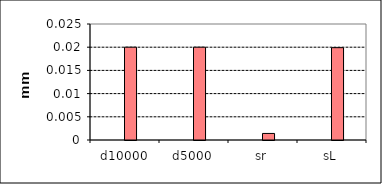
| Category | Series 1 | Series 0 | Series 5 | Series 6 |
|---|---|---|---|---|
| d10000 |  |  | 0.02 |  |
| d5000 |  |  | 0.02 |  |
| sr |  |  | 0.001 |  |
| sL |  |  | 0.02 |  |